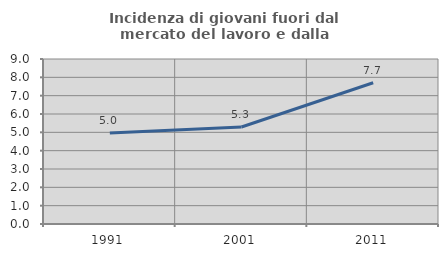
| Category | Incidenza di giovani fuori dal mercato del lavoro e dalla formazione  |
|---|---|
| 1991.0 | 4.969 |
| 2001.0 | 5.29 |
| 2011.0 | 7.705 |